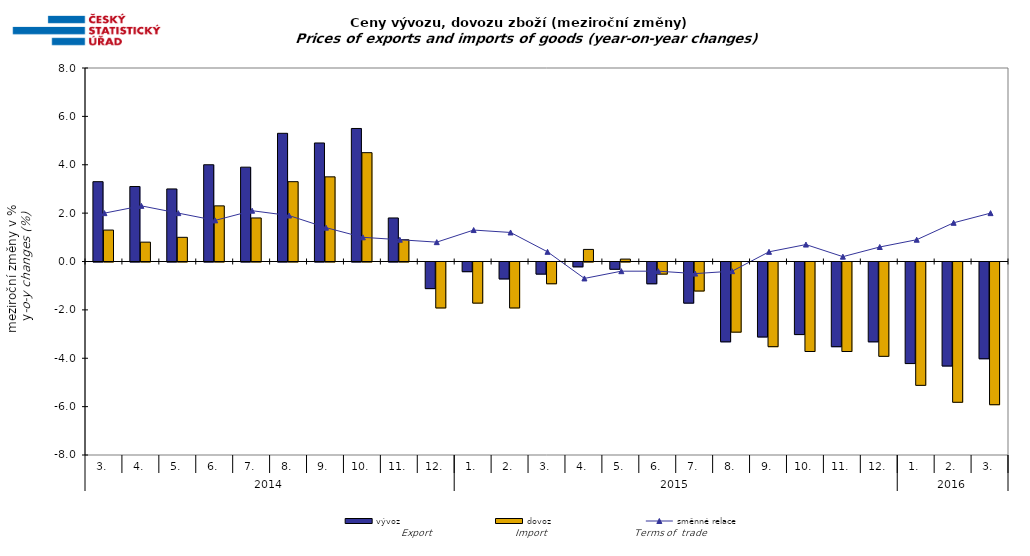
| Category | vývoz | dovoz |
|---|---|---|
| 0 | 3.3 | 1.3 |
| 1 | 3.1 | 0.8 |
| 2 | 3 | 1 |
| 3 | 4 | 2.3 |
| 4 | 3.9 | 1.8 |
| 5 | 5.3 | 3.3 |
| 6 | 4.9 | 3.5 |
| 7 | 5.5 | 4.5 |
| 8 | 1.8 | 0.9 |
| 9 | -1.1 | -1.9 |
| 10 | -0.4 | -1.7 |
| 11 | -0.7 | -1.9 |
| 12 | -0.5 | -0.9 |
| 13 | -0.2 | 0.5 |
| 14 | -0.3 | 0.1 |
| 15 | -0.9 | -0.5 |
| 16 | -1.7 | -1.2 |
| 17 | -3.3 | -2.9 |
| 18 | -3.1 | -3.5 |
| 19 | -3 | -3.7 |
| 20 | -3.5 | -3.7 |
| 21 | -3.3 | -3.9 |
| 22 | -4.2 | -5.1 |
| 23 | -4.3 | -5.8 |
| 24 | -4 | -5.9 |